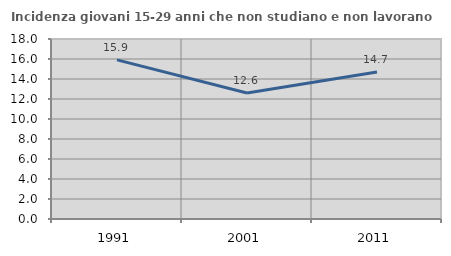
| Category | Incidenza giovani 15-29 anni che non studiano e non lavorano  |
|---|---|
| 1991.0 | 15.916 |
| 2001.0 | 12.596 |
| 2011.0 | 14.704 |